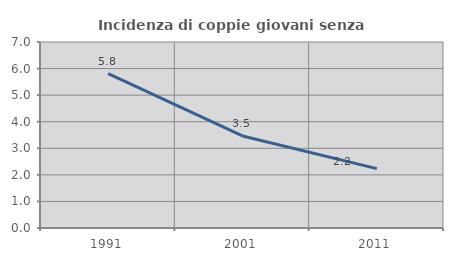
| Category | Incidenza di coppie giovani senza figli |
|---|---|
| 1991.0 | 5.806 |
| 2001.0 | 3.464 |
| 2011.0 | 2.234 |